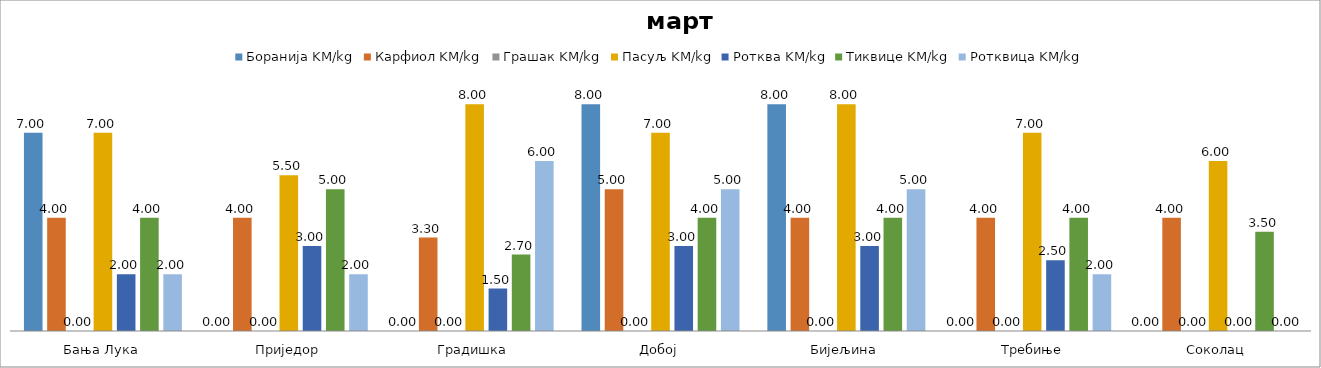
| Category | Боранија | Карфиол | Грашак | Пасуљ | Ротква | Тиквице | Ротквица |
|---|---|---|---|---|---|---|---|
| Бања Лука | 7 | 4 | 0 | 7 | 2 | 4 | 2 |
| Приједор | 0 | 4 | 0 | 5.5 | 3 | 5 | 2 |
| Градишка | 0 | 3.3 | 0 | 8 | 1.5 | 2.7 | 6 |
| Добој | 8 | 5 | 0 | 7 | 3 | 4 | 5 |
| Бијељина | 8 | 4 | 0 | 8 | 3 | 4 | 5 |
|  Требиње | 0 | 4 | 0 | 7 | 2.5 | 4 | 2 |
| Соколац | 0 | 4 | 0 | 6 | 0 | 3.5 | 0 |